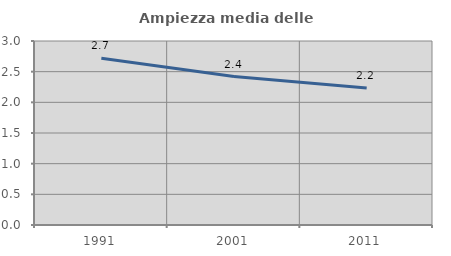
| Category | Ampiezza media delle famiglie |
|---|---|
| 1991.0 | 2.718 |
| 2001.0 | 2.42 |
| 2011.0 | 2.235 |